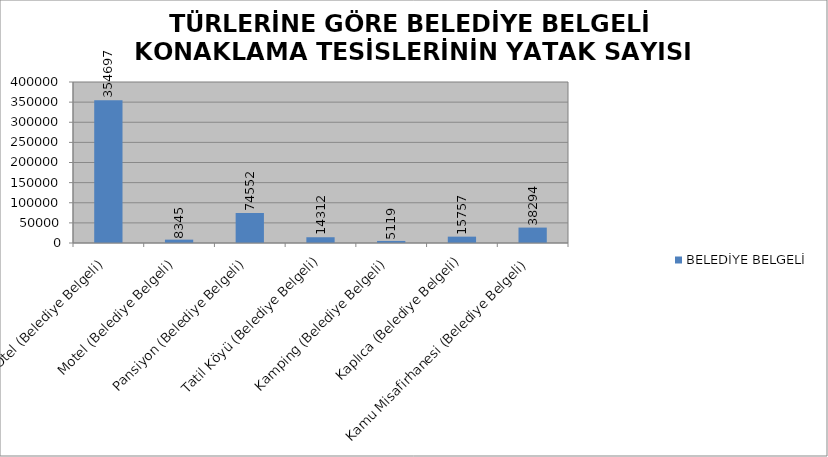
| Category | BELEDİYE BELGELİ |
|---|---|
| Otel (Belediye Belgeli) | 354697 |
| Motel (Belediye Belgeli) | 8345 |
| Pansiyon (Belediye Belgeli) | 74552 |
| Tatil Köyü (Belediye Belgeli) | 14312 |
| Kamping (Belediye Belgeli) | 5119 |
| Kaplıca (Belediye Belgeli) | 15757 |
| Kamu Misafirhanesi (Belediye Belgeli) | 38294 |